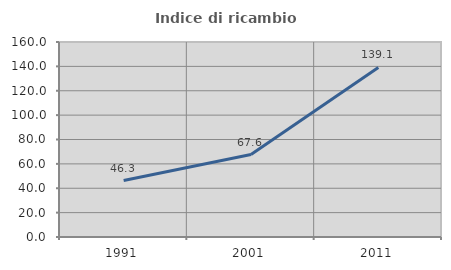
| Category | Indice di ricambio occupazionale  |
|---|---|
| 1991.0 | 46.313 |
| 2001.0 | 67.627 |
| 2011.0 | 139.107 |